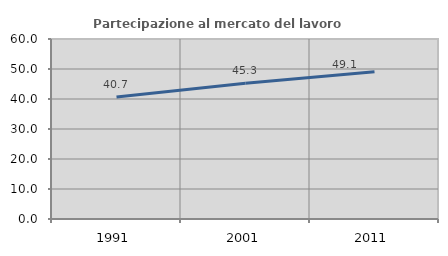
| Category | Partecipazione al mercato del lavoro  femminile |
|---|---|
| 1991.0 | 40.662 |
| 2001.0 | 45.255 |
| 2011.0 | 49.097 |